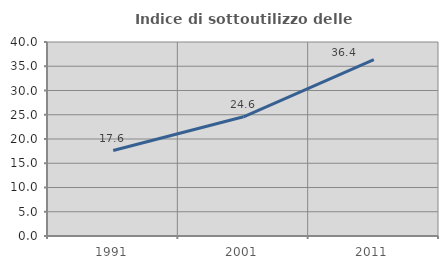
| Category | Indice di sottoutilizzo delle abitazioni  |
|---|---|
| 1991.0 | 17.624 |
| 2001.0 | 24.584 |
| 2011.0 | 36.375 |